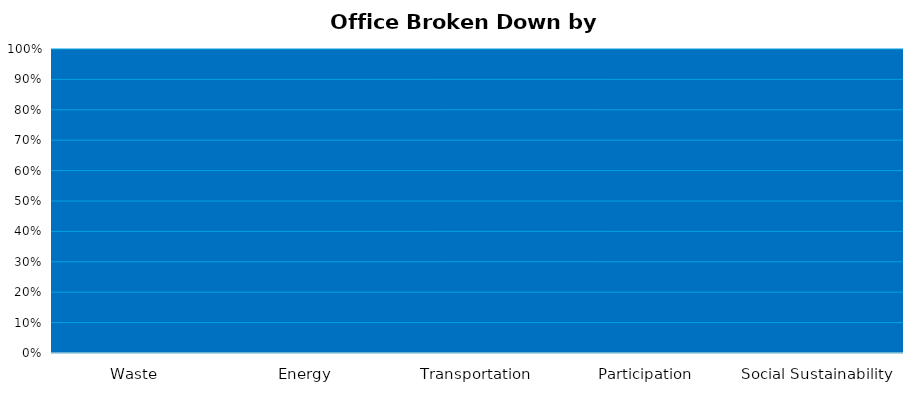
| Category | SCORE |
|---|---|
| Waste | 0 |
| Energy | 0 |
| Transportation | 0 |
| Participation | 0 |
| Social Sustainability | 0 |